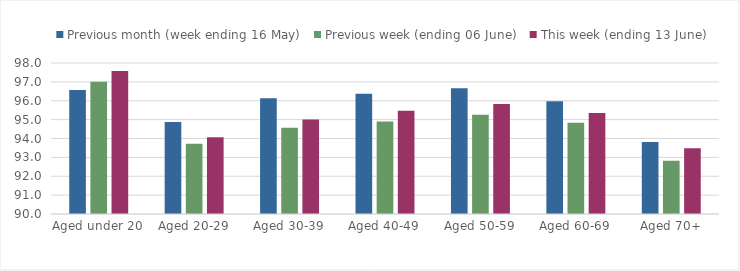
| Category | Previous month (week ending 16 May) | Previous week (ending 06 June) | This week (ending 13 June) |
|---|---|---|---|
| Aged under 20 | 96.571 | 97.01 | 97.571 |
| Aged 20-29 | 94.876 | 93.718 | 94.063 |
| Aged 30-39 | 96.126 | 94.575 | 95.012 |
| Aged 40-49 | 96.365 | 94.905 | 95.468 |
| Aged 50-59 | 96.668 | 95.264 | 95.83 |
| Aged 60-69 | 95.975 | 94.836 | 95.348 |
| Aged 70+ | 93.809 | 92.828 | 93.483 |